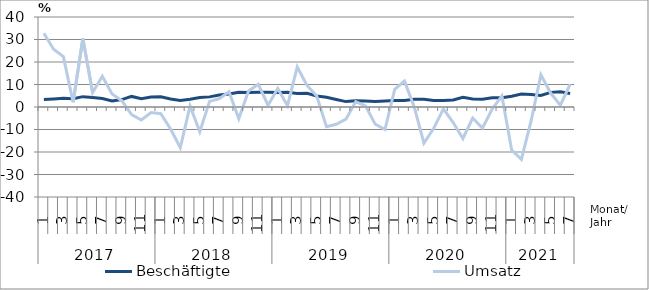
| Category | Beschäftigte | Umsatz |
|---|---|---|
| 0 | 3.3 | 32.8 |
| 1 | 3.6 | 25.7 |
| 2 | 3.9 | 22.4 |
| 3 | 3.7 | 2.1 |
| 4 | 4.6 | 30.4 |
| 5 | 4.2 | 6.4 |
| 6 | 3.8 | 13.7 |
| 7 | 2.7 | 5.8 |
| 8 | 3.3 | 2.8 |
| 9 | 4.7 | -3.4 |
| 10 | 3.7 | -5.8 |
| 11 | 4.4 | -2.5 |
| 12 | 4.5 | -3 |
| 13 | 3.6 | -9.8 |
| 14 | 2.9 | -18.1 |
| 15 | 3.4 | 0.5 |
| 16 | 4.2 | -11 |
| 17 | 4.5 | 2.5 |
| 18 | 5.3 | 3.7 |
| 19 | 5.8 | 6.8 |
| 20 | 6.6 | -5.2 |
| 21 | 6.5 | 7.1 |
| 22 | 6.6 | 10.1 |
| 23 | 6.6 | 0.8 |
| 24 | 6.4 | 8.2 |
| 25 | 6.5 | 0.6 |
| 26 | 6 | 17.8 |
| 27 | 6.1 | 9.6 |
| 28 | 4.9 | 4.9 |
| 29 | 4.3 | -8.8 |
| 30 | 3.3 | -7.7 |
| 31 | 2.4 | -5.4 |
| 32 | 2.8 | 2.4 |
| 33 | 2.7 | 0.5 |
| 34 | 2.5 | -7.6 |
| 35 | 2.7 | -10 |
| 36 | 2.9 | 7.8 |
| 37 | 2.9 | 11.5 |
| 38 | 3.4 | 0.1 |
| 39 | 3.4 | -16.1 |
| 40 | 2.9 | -9.5 |
| 41 | 2.9 | -0.8 |
| 42 | 3.1 | -6.9 |
| 43 | 4.3 | -14 |
| 44 | 3.6 | -4.9 |
| 45 | 3.4 | -9.4 |
| 46 | 4.1 | -0.9 |
| 47 | 4.1 | 4.9 |
| 48 | 4.8 | -19.1 |
| 49 | 5.8 | -23.3 |
| 50 | 5.6 | -6.1 |
| 51 | 5.1 | 14.3 |
| 52 | 6.5 | 6.2 |
| 53 | 6.8 | 0.8 |
| 54 | 6 | 10.2 |